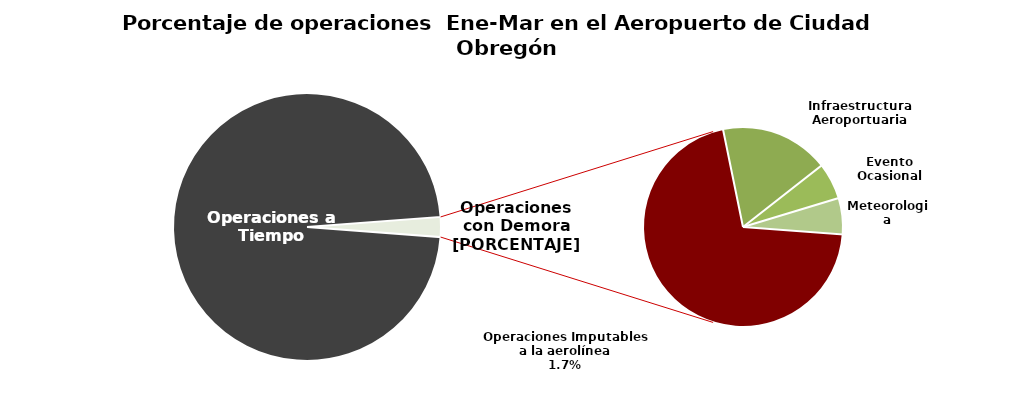
| Category | Series 0 |
|---|---|
| Operaciones a Tiempo | 693 |
| Operaciones Imputables a la aerolínea | 12 |
| Infraestructura Aeroportuaria | 3 |
| Evento Ocasional | 1 |
| Meteorologia | 1 |